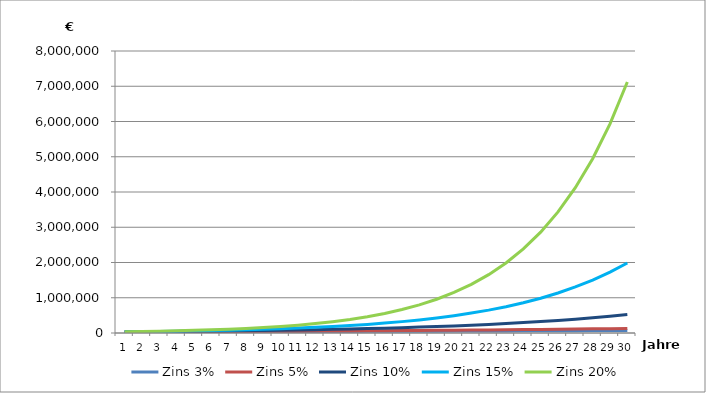
| Category | Zins 3% | Zins 5% | Zins 10% | Zins 15% | Zins 20% |
|---|---|---|---|---|---|
| 0 | 30900 | 31500 | 33000 | 34500 | 36000 |
| 1 | 31827 | 33075 | 36300 | 39675 | 43200 |
| 2 | 32781.81 | 34728.75 | 39930 | 45626.25 | 51840 |
| 3 | 33765.264 | 36465.188 | 43923 | 52470.187 | 62208 |
| 4 | 34778.222 | 38288.447 | 48315.3 | 60340.716 | 74649.6 |
| 5 | 35821.569 | 40202.869 | 53146.83 | 69391.823 | 89579.52 |
| 6 | 36896.216 | 42213.013 | 58461.513 | 79800.596 | 107495.424 |
| 7 | 38003.102 | 44323.663 | 64307.664 | 91770.686 | 128994.509 |
| 8 | 39143.196 | 46539.846 | 70738.431 | 105536.289 | 154793.411 |
| 9 | 40317.491 | 48866.839 | 77812.274 | 121366.732 | 185752.093 |
| 10 | 41527.016 | 51310.181 | 85593.501 | 139571.742 | 222902.511 |
| 11 | 42772.827 | 53875.69 | 94152.851 | 160507.503 | 267483.013 |
| 12 | 44056.011 | 56569.474 | 103568.136 | 184583.629 | 320979.616 |
| 13 | 45377.692 | 59397.948 | 113924.95 | 212271.173 | 385175.539 |
| 14 | 46739.022 | 62367.845 | 125317.445 | 244111.849 | 462210.647 |
| 15 | 48141.193 | 65486.238 | 137849.19 | 280728.626 | 554652.777 |
| 16 | 49585.429 | 68760.55 | 151634.109 | 322837.92 | 665583.332 |
| 17 | 51072.992 | 72198.577 | 166797.519 | 371263.608 | 798699.998 |
| 18 | 52605.182 | 75808.506 | 183477.271 | 426953.149 | 958439.998 |
| 19 | 54183.337 | 79598.931 | 201824.998 | 490996.122 | 1150127.998 |
| 20 | 55808.837 | 83578.878 | 222007.498 | 564645.54 | 1380153.597 |
| 21 | 57483.102 | 87757.822 | 244208.248 | 649342.371 | 1656184.317 |
| 22 | 59207.595 | 92145.713 | 268629.073 | 746743.727 | 1987421.18 |
| 23 | 60983.823 | 96752.998 | 295491.98 | 858755.286 | 2384905.416 |
| 24 | 62813.338 | 101590.648 | 325041.178 | 987568.579 | 2861886.499 |
| 25 | 64697.738 | 106670.181 | 357545.296 | 1135703.865 | 3434263.799 |
| 26 | 66638.67 | 112003.69 | 393299.826 | 1306059.445 | 4121116.559 |
| 27 | 68637.83 | 117603.874 | 432629.808 | 1501968.362 | 4945339.871 |
| 28 | 70696.965 | 123484.068 | 475892.789 | 1727263.616 | 5934407.845 |
| 29 | 72817.874 | 129658.271 | 523482.068 | 1986353.159 | 7121289.414 |